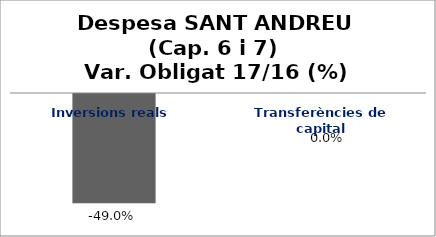
| Category | Series 0 |
|---|---|
| Inversions reals | -0.49 |
| Transferències de capital | 0 |